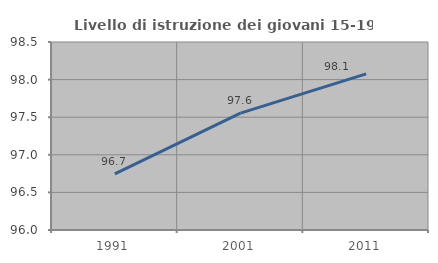
| Category | Livello di istruzione dei giovani 15-19 anni |
|---|---|
| 1991.0 | 96.746 |
| 2001.0 | 97.554 |
| 2011.0 | 98.077 |